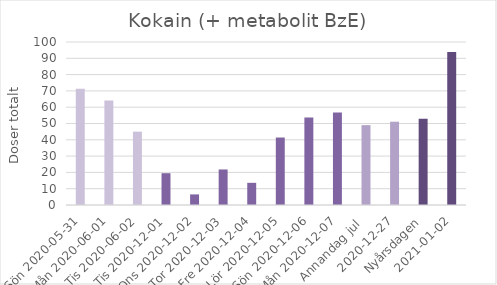
| Category | Kokain (+ metabolit BzE) |
|---|---|
| Sön 2020-05-31 | 71.3 |
| Mån 2020-06-01 | 64.1 |
|  Tis 2020-06-02 | 45 |
| Tis 2020-12-01 | 19.5 |
| Ons 2020-12-02 | 6.5 |
| Tor 2020-12-03 | 21.8 |
| Fre 2020-12-04 | 13.6 |
| Lör 2020-12-05 | 41.4 |
| Sön 2020-12-06 | 53.7 |
| Mån 2020-12-07 | 56.7 |
| Annandag jul  | 49 |
| 2020-12-27 | 51.1 |
| Nyårsdagen | 52.9 |
| 2021-01-02 | 93.8 |